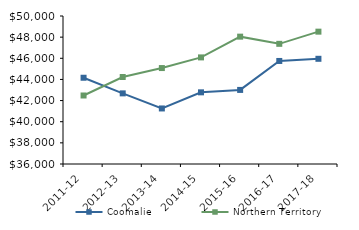
| Category | Coomalie | Northern Territory |
|---|---|---|
| 2011-12 | 44159 | 42481 |
| 2012-13 | 42681.07 | 44232.02 |
| 2013-14 | 41254.59 | 45075.51 |
| 2014-15 | 42779 | 46083.65 |
| 2015-16 | 43007.5 | 48046.27 |
| 2016-17 | 45746.67 | 47367.05 |
| 2017-18 | 45951.48 | 48519 |